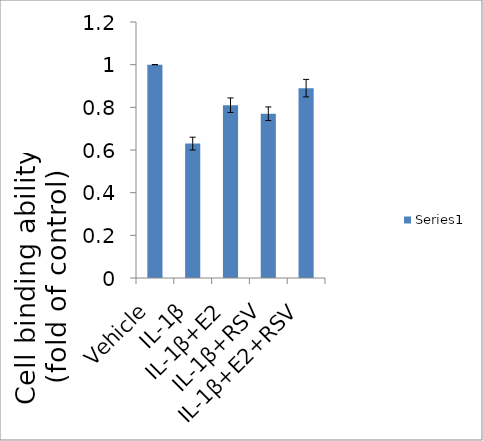
| Category | Series 0 |
|---|---|
| Vehicle | 1 |
| IL-1β | 0.63 |
| IL-1β+E2 | 0.81 |
| IL-1β+RSV | 0.77 |
| IL-1β+E2+RSV | 0.89 |